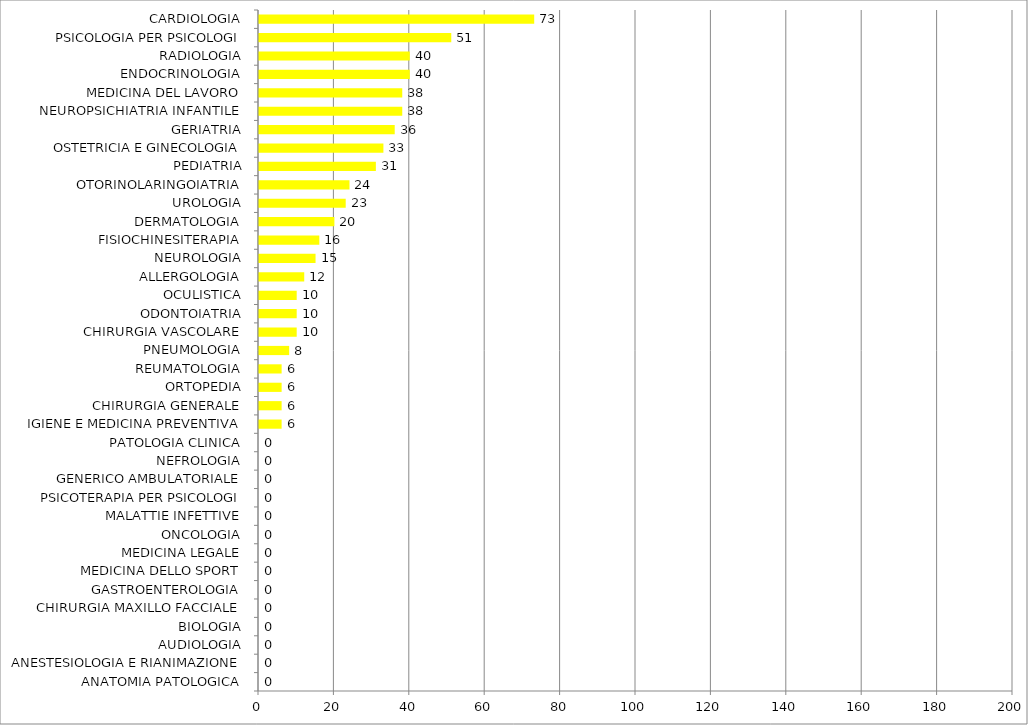
| Category | Series 0 |
|---|---|
| ANATOMIA PATOLOGICA | 0 |
| ANESTESIOLOGIA E RIANIMAZIONE | 0 |
| AUDIOLOGIA | 0 |
| BIOLOGIA | 0 |
| CHIRURGIA MAXILLO FACCIALE | 0 |
| GASTROENTEROLOGIA | 0 |
| MEDICINA DELLO SPORT | 0 |
| MEDICINA LEGALE | 0 |
| ONCOLOGIA | 0 |
| MALATTIE INFETTIVE | 0 |
| PSICOTERAPIA PER PSICOLOGI | 0 |
| GENERICO AMBULATORIALE | 0 |
| NEFROLOGIA | 0 |
| PATOLOGIA CLINICA | 0 |
| IGIENE E MEDICINA PREVENTIVA | 6 |
| CHIRURGIA GENERALE | 6 |
| ORTOPEDIA | 6 |
| REUMATOLOGIA | 6 |
| PNEUMOLOGIA | 8 |
| CHIRURGIA VASCOLARE | 10 |
| ODONTOIATRIA | 10 |
| OCULISTICA | 10 |
| ALLERGOLOGIA | 12 |
| NEUROLOGIA | 15 |
| FISIOCHINESITERAPIA | 16 |
| DERMATOLOGIA | 20 |
| UROLOGIA | 23 |
| OTORINOLARINGOIATRIA | 24 |
| PEDIATRIA | 31 |
| OSTETRICIA E GINECOLOGIA | 33 |
| GERIATRIA | 36 |
| NEUROPSICHIATRIA INFANTILE | 38 |
| MEDICINA DEL LAVORO | 38 |
| ENDOCRINOLOGIA | 40 |
| RADIOLOGIA | 40 |
| PSICOLOGIA PER PSICOLOGI | 51 |
| CARDIOLOGIA | 73 |